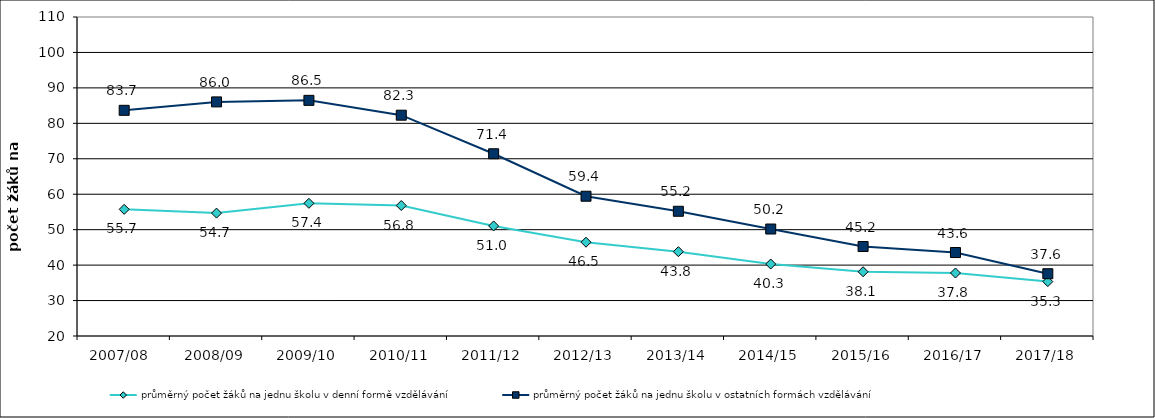
| Category | průměrný počet žáků na jednu školu v denní formě vzdělávání | průměrný počet žáků na jednu školu v ostatních formách vzdělávání |
|---|---|---|
| 2007/08  | 55.736 | 83.673 |
| 2008/09 | 54.675 | 86.048 |
| 2009/10 | 57.431 | 86.484 |
| 2010/11 | 56.811 | 82.296 |
| 2011/12 | 51.039 | 71.415 |
| 2012/13 | 46.463 | 59.432 |
| 2013/14 | 43.791 | 55.188 |
| 2014/15 | 40.309 | 50.181 |
| 2015/16 | 38.126 | 45.249 |
| 2016/17 | 37.771 | 43.552 |
| 2017/18 | 35.346 | 37.574 |